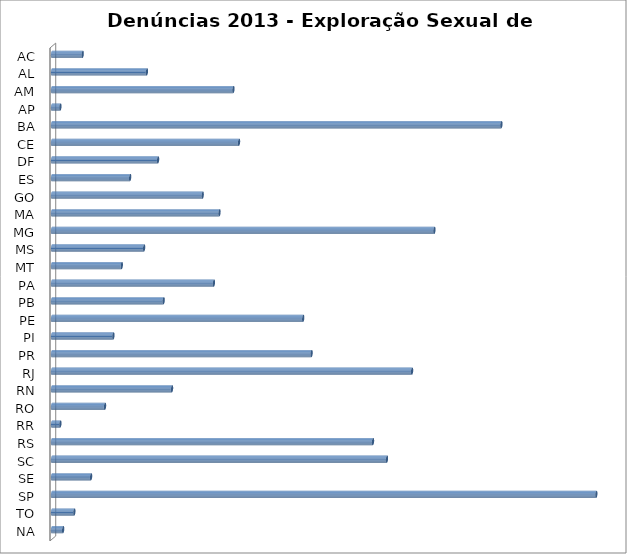
| Category | Series 0 |
|---|---|
| AC | 11 |
| AL | 34 |
| AM | 65 |
| AP | 3 |
| BA | 161 |
| CE | 67 |
| DF | 38 |
| ES | 28 |
| GO | 54 |
| MA | 60 |
| MG | 137 |
| MS | 33 |
| MT | 25 |
| PA | 58 |
| PB | 40 |
| PE | 90 |
| PI | 22 |
| PR | 93 |
| RJ | 129 |
| RN | 43 |
| RO | 19 |
| RR | 3 |
| RS | 115 |
| SC | 120 |
| SE | 14 |
| SP | 195 |
| TO | 8 |
| NA | 4 |